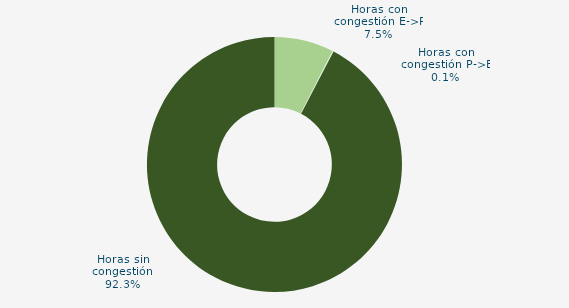
| Category | Horas con congestión E->P |
|---|---|
| Horas con congestión E->P | 7.527 |
| Horas con congestión P->E | 0.134 |
| Horas sin congestión | 92.339 |